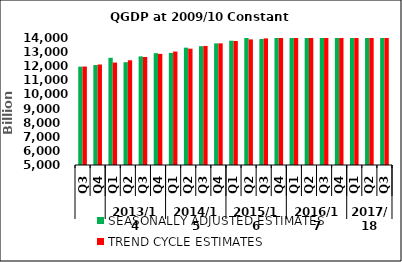
| Category | SEASONALLY ADJUSTED ESTIMATES | TREND CYCLE ESTIMATES |
|---|---|---|
| 0 | 11970.675 | 11979.198 |
| 1 | 12084.353 | 12121.677 |
| 2 | 12596.735 | 12260.469 |
| 3 | 12286.319 | 12421.622 |
| 4 | 12696.892 | 12652.011 |
| 5 | 12924.66 | 12874.404 |
| 6 | 12946.645 | 13042.353 |
| 7 | 13315.337 | 13242.241 |
| 8 | 13419.881 | 13436.549 |
| 9 | 13619.108 | 13620.212 |
| 10 | 13810.37 | 13788.33 |
| 11 | 14002.919 | 13902.142 |
| 12 | 13932.311 | 13972.344 |
| 13 | 14059.614 | 14049.852 |
| 14 | 14140.936 | 14175.326 |
| 15 | 14360.291 | 14371.182 |
| 16 | 14591.112 | 14648.535 |
| 17 | 14984.02 | 14914.445 |
| 18 | 15133.614 | 15135.341 |
| 19 | 15293.907 | 15315.851 |
| 20 | 15465.9 | 15499.559 |